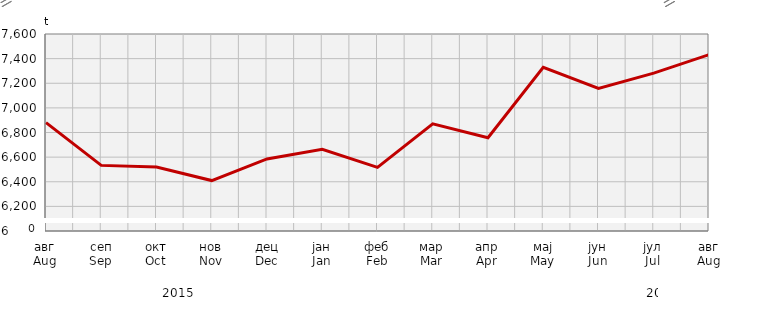
| Category | Прикупљање крављег млијека
Collecting of cow’s milk |
|---|---|
| авг
Aug | 6880.441 |
| сеп
Sep | 6532.974 |
| окт
Oct | 6519.778 |
| нов
Nov | 6409.6 |
| дец
Dec | 6585.351 |
| јан
Jan | 6663.893 |
| феб
Feb | 6516.44 |
| мар
Mar | 6870.8 |
| апр
Apr | 6757.289 |
| мај
May | 7329.328 |
| јун
Jun | 7158.306 |
| јул
Jul | 7282.65 |
| авг
Aug | 7431.863 |